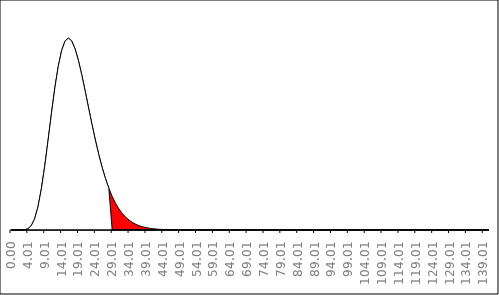
| Category | Series 1 | Series 2 |
|---|---|---|
| 0.0 | 0 | 0 |
| 0.005 | 0 | 0 |
| 1.005 | 0 | 0 |
| 2.005 | 0 | 0 |
| 3.005 | 0 | 0 |
| 4.005 | 0 | 0 |
| 5.005 | 0.002 | 0.002 |
| 6.005 | 0.004 | 0.004 |
| 7.005 | 0.008 | 0.008 |
| 8.004999999999999 | 0.015 | 0.015 |
| 9.004999999999999 | 0.023 | 0.023 |
| 10.004999999999999 | 0.033 | 0.033 |
| 11.004999999999999 | 0.042 | 0.042 |
| 12.004999999999999 | 0.052 | 0.052 |
| 13.004999999999999 | 0.059 | 0.059 |
| 14.004999999999999 | 0.065 | 0.065 |
| 15.004999999999999 | 0.069 | 0.069 |
| 16.005 | 0.07 | 0.07 |
| 17.005 | 0.069 | 0.069 |
| 18.005 | 0.066 | 0.066 |
| 19.005 | 0.062 | 0.062 |
| 20.005 | 0.056 | 0.056 |
| 21.005 | 0.05 | 0.05 |
| 22.005 | 0.044 | 0.044 |
| 23.005 | 0.038 | 0.038 |
| 24.005 | 0.033 | 0.033 |
| 25.005 | 0.028 | 0.028 |
| 26.005 | 0.023 | 0.023 |
| 27.005 | 0.019 | 0.019 |
| 28.005 | 0.015 | 0.015 |
| 29.005 | 0.012 | 0 |
| 30.005 | 0.01 | 0 |
| 31.005 | 0.008 | 0 |
| 32.004999999999995 | 0.006 | 0 |
| 33.004999999999995 | 0.005 | 0 |
| 34.004999999999995 | 0.004 | 0 |
| 35.004999999999995 | 0.003 | 0 |
| 36.004999999999995 | 0.002 | 0 |
| 37.004999999999995 | 0.002 | 0 |
| 38.004999999999995 | 0.001 | 0 |
| 39.004999999999995 | 0.001 | 0 |
| 40.004999999999995 | 0.001 | 0 |
| 41.004999999999995 | 0 | 0 |
| 42.004999999999995 | 0 | 0 |
| 43.004999999999995 | 0 | 0 |
| 44.004999999999995 | 0 | 0 |
| 45.004999999999995 | 0 | 0 |
| 46.004999999999995 | 0 | 0 |
| 47.004999999999995 | 0 | 0 |
| 48.004999999999995 | 0 | 0 |
| 49.004999999999995 | 0 | 0 |
| 50.004999999999995 | 0 | 0 |
| 51.004999999999995 | 0 | 0 |
| 52.004999999999995 | 0 | 0 |
| 53.004999999999995 | 0 | 0 |
| 54.004999999999995 | 0 | 0 |
| 55.004999999999995 | 0 | 0 |
| 56.004999999999995 | 0 | 0 |
| 57.004999999999995 | 0 | 0 |
| 58.004999999999995 | 0 | 0 |
| 59.004999999999995 | 0 | 0 |
| 60.004999999999995 | 0 | 0 |
| 61.004999999999995 | 0 | 0 |
| 62.004999999999995 | 0 | 0 |
| 63.004999999999995 | 0 | 0 |
| 64.005 | 0 | 0 |
| 65.005 | 0 | 0 |
| 66.005 | 0 | 0 |
| 67.005 | 0 | 0 |
| 68.005 | 0 | 0 |
| 69.005 | 0 | 0 |
| 70.005 | 0 | 0 |
| 71.005 | 0 | 0 |
| 72.005 | 0 | 0 |
| 73.005 | 0 | 0 |
| 74.005 | 0 | 0 |
| 75.005 | 0 | 0 |
| 76.005 | 0 | 0 |
| 77.005 | 0 | 0 |
| 78.005 | 0 | 0 |
| 79.005 | 0 | 0 |
| 80.005 | 0 | 0 |
| 81.005 | 0 | 0 |
| 82.005 | 0 | 0 |
| 83.005 | 0 | 0 |
| 84.005 | 0 | 0 |
| 85.005 | 0 | 0 |
| 86.005 | 0 | 0 |
| 87.005 | 0 | 0 |
| 88.005 | 0 | 0 |
| 89.005 | 0 | 0 |
| 90.005 | 0 | 0 |
| 91.005 | 0 | 0 |
| 92.005 | 0 | 0 |
| 93.005 | 0 | 0 |
| 94.005 | 0 | 0 |
| 95.005 | 0 | 0 |
| 96.005 | 0 | 0 |
| 97.005 | 0 | 0 |
| 98.005 | 0 | 0 |
| 99.005 | 0 | 0 |
| 100.005 | 0 | 0 |
| 101.005 | 0 | 0 |
| 102.005 | 0 | 0 |
| 103.005 | 0 | 0 |
| 104.005 | 0 | 0 |
| 105.005 | 0 | 0 |
| 106.005 | 0 | 0 |
| 107.005 | 0 | 0 |
| 108.005 | 0 | 0 |
| 109.005 | 0 | 0 |
| 110.005 | 0 | 0 |
| 111.005 | 0 | 0 |
| 112.005 | 0 | 0 |
| 113.005 | 0 | 0 |
| 114.005 | 0 | 0 |
| 115.005 | 0 | 0 |
| 116.005 | 0 | 0 |
| 117.005 | 0 | 0 |
| 118.005 | 0 | 0 |
| 119.005 | 0 | 0 |
| 120.005 | 0 | 0 |
| 121.005 | 0 | 0 |
| 122.005 | 0 | 0 |
| 123.005 | 0 | 0 |
| 124.005 | 0 | 0 |
| 125.005 | 0 | 0 |
| 126.005 | 0 | 0 |
| 127.005 | 0 | 0 |
| 128.005 | 0 | 0 |
| 129.005 | 0 | 0 |
| 130.005 | 0 | 0 |
| 131.005 | 0 | 0 |
| 132.005 | 0 | 0 |
| 133.005 | 0 | 0 |
| 134.005 | 0 | 0 |
| 135.005 | 0 | 0 |
| 136.005 | 0 | 0 |
| 137.005 | 0 | 0 |
| 138.005 | 0 | 0 |
| 139.005 | 0 | 0 |
| 140.005 | 0 | 0 |
| 141.005 | 0 | 0 |